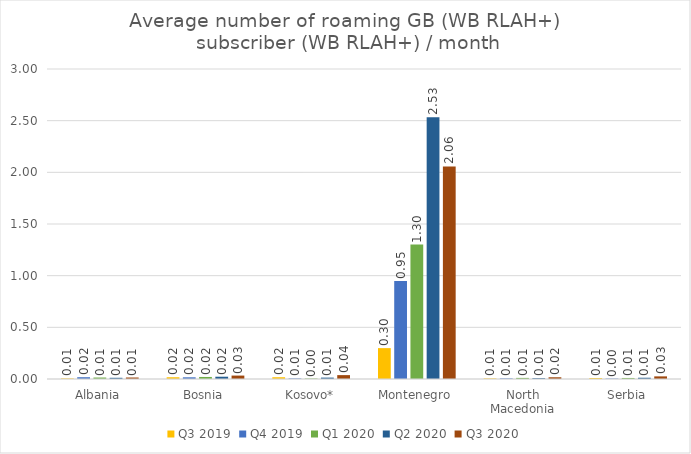
| Category | Q3 2019 | Q4 2019 | Q1 2020 | Q2 2020 | Q3 2020 |
|---|---|---|---|---|---|
| Albania | 0.006 | 0.017 | 0.014 | 0.012 | 0.014 |
| Bosnia | 0.017 | 0.016 | 0.02 | 0.022 | 0.033 |
| Kosovo* | 0.017 | 0.005 | 0.005 | 0.013 | 0.038 |
| Montenegro | 0.299 | 0.947 | 1.301 | 2.533 | 2.056 |
| North Macedonia | 0.006 | 0.006 | 0.011 | 0.008 | 0.017 |
| Serbia | 0.009 | 0.004 | 0.01 | 0.012 | 0.025 |